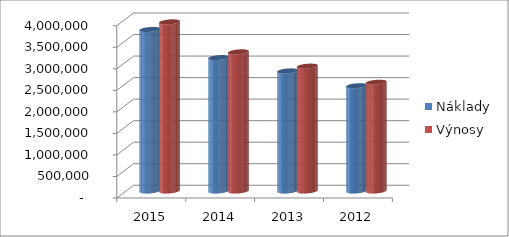
| Category | Náklady | Výnosy |
|---|---|---|
| 2015.0 | 3750987 | 3926628 |
| 2014.0 | 3098213 | 3230583 |
| 2013.0 | 2788439 | 2898957 |
| 2012.0 | 2444771 | 2525070 |